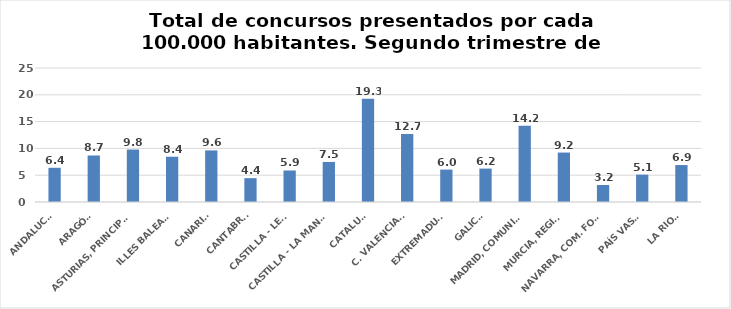
| Category | Series 0 |
|---|---|
| ANDALUCÍA | 6.381 |
| ARAGÓN | 8.677 |
| ASTURIAS, PRINCIPADO | 9.787 |
| ILLES BALEARS | 8.445 |
| CANARIAS | 9.625 |
| CANTABRIA | 4.45 |
| CASTILLA - LEÓN | 5.879 |
| CASTILLA - LA MANCHA | 7.471 |
| CATALUÑA | 19.286 |
| C. VALENCIANA | 12.695 |
| EXTREMADURA | 6.045 |
| GALICIA | 6.236 |
| MADRID, COMUNIDAD | 14.232 |
| MURCIA, REGIÓN | 9.223 |
| NAVARRA, COM. FORAL | 3.177 |
| PAÍS VASCO | 5.107 |
| LA RIOJA | 6.892 |